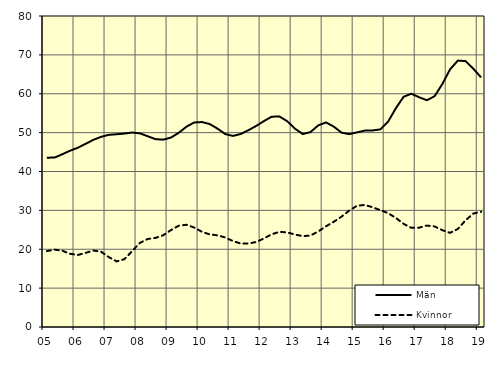
| Category | Män | Kvinnor |
|---|---|---|
| 5.0 | 43.55 | 19.52 |
| nan | 43.59 | 19.9 |
| 6.0 | 44.44 | 19.62 |
| 6.0 | 45.36 | 18.83 |
| 6.0 | 46.11 | 18.53 |
| nan | 47.12 | 19.07 |
| 7.0 | 48.15 | 19.67 |
| 7.0 | 48.92 | 19.34 |
| 7.0 | 49.44 | 17.97 |
| nan | 49.58 | 16.87 |
| 8.0 | 49.76 | 17.45 |
| 8.0 | 50.02 | 19.52 |
| 8.0 | 49.81 | 21.64 |
| nan | 49.07 | 22.64 |
| 9.0 | 48.33 | 22.92 |
| 9.0 | 48.19 | 23.6 |
| 9.0 | 48.73 | 24.92 |
| nan | 49.95 | 26.06 |
| 10.0 | 51.52 | 26.3 |
| 10.0 | 52.61 | 25.57 |
| 10.0 | 52.72 | 24.48 |
| nan | 52.21 | 23.82 |
| 11.0 | 51.03 | 23.58 |
| 11.0 | 49.64 | 23.03 |
| 11.0 | 49.15 | 22.1 |
| nan | 49.65 | 21.47 |
| 12.0 | 50.63 | 21.46 |
| 12.0 | 51.73 | 21.87 |
| 12.0 | 52.98 | 22.78 |
| nan | 54.1 | 23.87 |
| 13.0 | 54.15 | 24.47 |
| 13.0 | 52.93 | 24.33 |
| 13.0 | 51.01 | 23.78 |
| nan | 49.63 | 23.38 |
| 14.0 | 50.14 | 23.53 |
| 14.0 | 51.87 | 24.58 |
| 14.0 | 52.62 | 25.91 |
| nan | 51.55 | 27.06 |
| 15.0 | 49.99 | 28.39 |
| 15.0 | 49.61 | 29.96 |
| 15.0 | 50.07 | 31.19 |
| nan | 50.52 | 31.4 |
| 16.0 | 50.56 | 30.8 |
| 16.0 | 50.83 | 30.07 |
| 16.0 | 52.82 | 29.29 |
| nan | 56.26 | 28.06 |
| 17.0 | 59.21 | 26.54 |
| 17.0 | 60.02 | 25.5 |
| 17.0 | 59.1 | 25.55 |
| nan | 58.34 | 26.09 |
| 18.0 | 59.36 | 25.87 |
| 18.0 | 62.51 | 24.91 |
| 18.0 | 66.29 | 24.21 |
| nan | 68.53 | 25.23 |
| 19.0 | 68.4 | 27.45 |
| 19.0 | 66.43 | 29.19 |
| 19.0 | 64.2 | 29.62 |